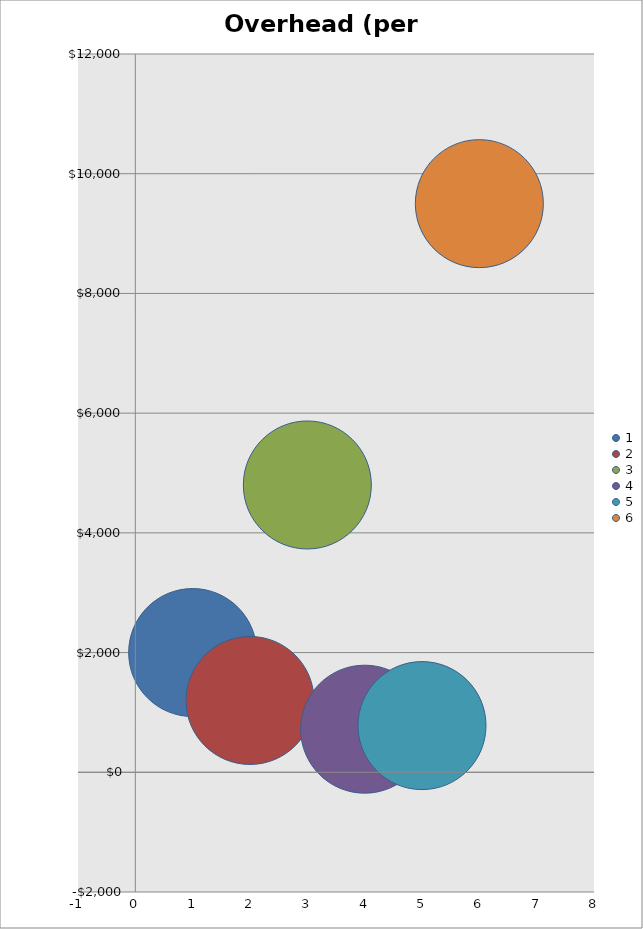
| Category | Overhead (per Month) |
|---|---|
| 0 | 2000 |
| 1 | 1200 |
| 2 | 4800 |
| 3 | 720 |
| 4 | 780 |
| 5 | 9500 |